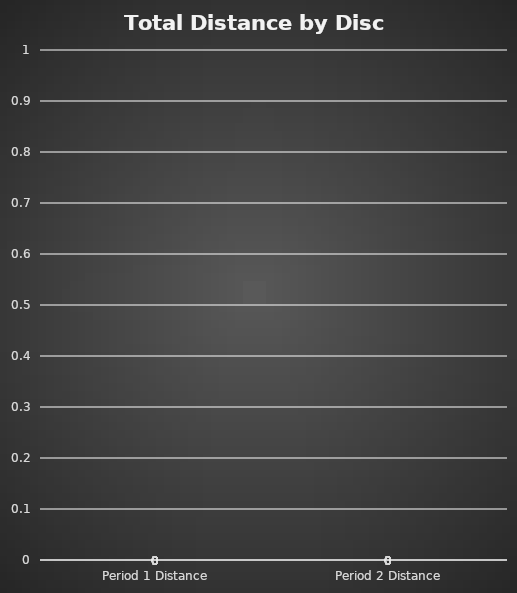
| Category | Putter | Put-Mid Overlap | Midrange | Mid-Fair Overlap | Fairway Driver | Fair-Dist Overlap | Distance Driver | Dist-Max Overlap | Max Distance Driver |
|---|---|---|---|---|---|---|---|---|---|
| Period 1 Distance | 0 | 0 | 0 | 0 | 0 | 0 | 0 | 0 | 0 |
| Period 2 Distance | 0 | 0 | 0 | 0 | 0 | 0 | 0 | 0 | 0 |